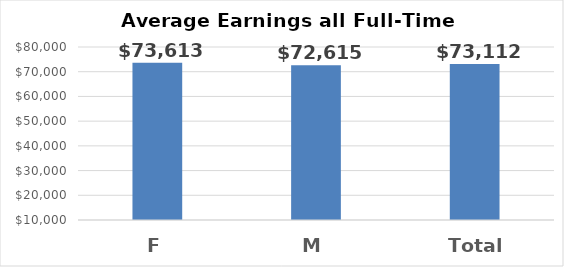
| Category | Mean |
|---|---|
| F | 73613.196 |
| M | 72614.779 |
| Total | 73112.301 |